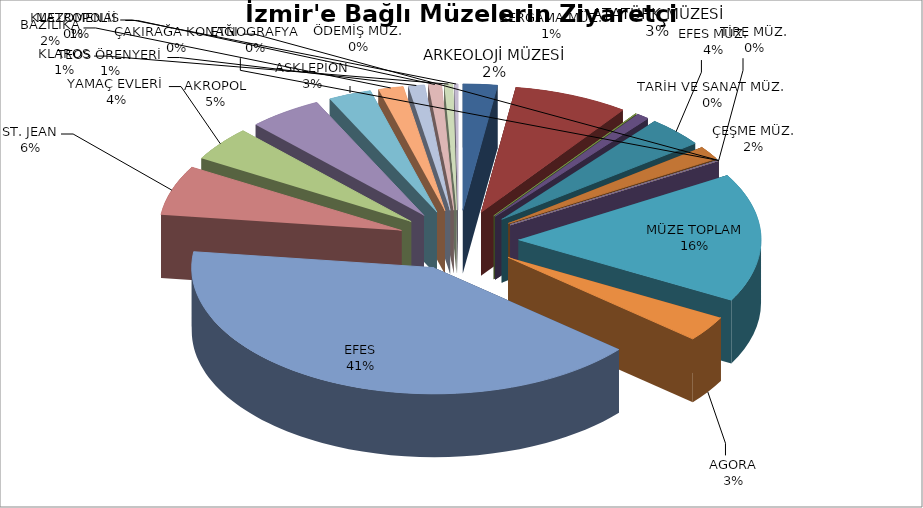
| Category | Series 0 |
|---|---|
| ARKEOLOJİ MÜZESİ | 7325 |
| ATATÜRK MÜZESİ | 24541 |
| TARİH VE SANAT MÜZ. | 193 |
| BERGAMA MÜZ. | 2704 |
| EFES MÜZ. | 12361 |
| ÇEŞME MÜZ. | 5449 |
| ÖDEMİŞ MÜZ. | 237 |
| TİRE MÜZ. | 0 |
| ÇAKIRAĞA KONAĞI | 0 |
| ETNOGRAFYA | 0 |
| MÜZE TOPLAM | 52810 |
| AGORA | 10434 |
| EFES | 130771 |
| ST. JEAN | 20364 |
| YAMAÇ EVLERİ | 14202 |
| AKROPOL | 15764 |
| ASKLEPİON | 9158 |
| BAZİLİKA | 5322 |
| TEOS ÖRENYERİ | 3466 |
| METROPOLİS | 2811 |
| KLAROS | 1801 |
| KLAZOMENAİ | 783 |